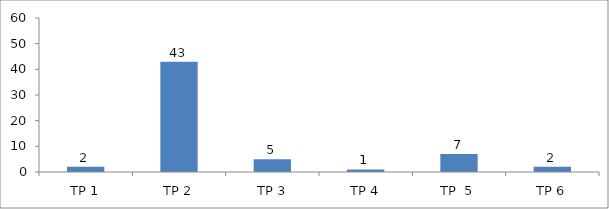
| Category | BIL. MURID |
|---|---|
| TP 1 | 2 |
| TP 2 | 43 |
|  TP 3 | 5 |
| TP 4 | 1 |
| TP  5 | 7 |
| TP 6 | 2 |